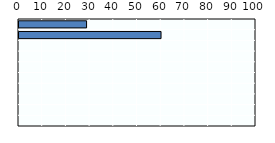
| Category | Payment rate (%) |
|---|---|
| Korea | 28.51 |
| Japan | 59.935 |
| OECD average | 0 |
| Australia | 0 |
| China | 0 |
| Indonesia | 0 |
| New Zealand | 0 |
| Singapore | 0 |
| Thailand | 0 |
| Viet Nam | 0 |